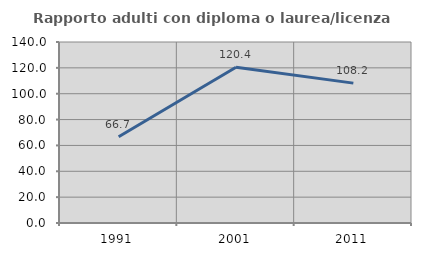
| Category | Rapporto adulti con diploma o laurea/licenza media  |
|---|---|
| 1991.0 | 66.667 |
| 2001.0 | 120.408 |
| 2011.0 | 108.197 |